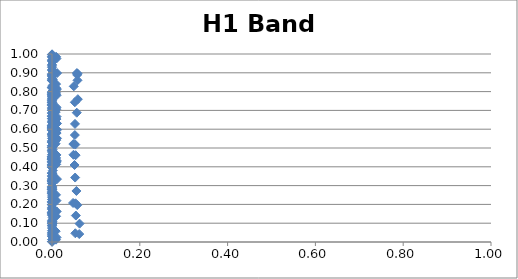
| Category | H1 Band 1 |
|---|---|
| 2.0123843859555475e-10 | 0.06 |
| 2.1284873776763067e-10 | 0.28 |
| 2.4249087996374483e-10 | 0.725 |
| 2.516043418277026e-10 | 0.312 |
| 2.564209724702538e-10 | 0.313 |
| 2.660455700669723e-10 | 0.41 |
| 2.730200291383123e-10 | 0.733 |
| 3.0289745515244437e-10 | 0.397 |
| 3.2020751368826646e-10 | 0.512 |
| 3.2856602494830163e-10 | 0.501 |
| 3.408278143051066e-10 | 0.443 |
| 4.097851320816054e-10 | 0.863 |
| 7.349655657294522e-09 | 0.214 |
| 7.65018932688669e-09 | 0.819 |
| 7.73707583981094e-09 | 0.259 |
| 8.053008278244601e-09 | 0.174 |
| 8.718170969962843e-09 | 0.178 |
| 9.017666419560588e-09 | 0.985 |
| 9.073001933340815e-09 | 0.8 |
| 9.175573883879208e-09 | 0.029 |
| 9.384345860370436e-09 | 0.04 |
| 9.490340358498547e-09 | 0.617 |
| 9.548495748271502e-09 | 0.116 |
| 9.71781717434907e-09 | 0.2 |
| 9.875696351178392e-09 | 0.577 |
| 1.0112151615350308e-08 | 0.086 |
| 1.0686748233231446e-08 | 0.479 |
| 1.1119259050346358e-08 | 0.965 |
| 1.1244268139276162e-08 | 0.148 |
| 1.1512530348595553e-08 | 0.744 |
| 1.1698698931164805e-08 | 0.529 |
| 1.1904995249875154e-08 | 0.502 |
| 1.1977496901092873e-08 | 0.436 |
| 1.2385362527585035e-08 | 0.796 |
| 1.409043215088435e-08 | 0.774 |
| 1.465629644231093e-08 | 0.184 |
| 2.0296841910398058e-07 | 0.27 |
| 2.126493957548408e-07 | 0.151 |
| 2.3696336486193496e-07 | 0.197 |
| 2.4433195648884153e-07 | 0.465 |
| 2.482074914962463e-07 | 0.199 |
| 2.5591380676002896e-07 | 0.743 |
| 2.614676844095914e-07 | 0.441 |
| 2.849876462575096e-07 | 0.409 |
| 2.9842655961281014e-07 | 0.789 |
| 3.0486981994032667e-07 | 0.213 |
| 3.1427016446304065e-07 | 0.617 |
| 3.4430345774041037e-07 | 0.969 |
| 3.453782721627504e-07 | 0.622 |
| 3.604348686617844e-07 | 0.912 |
| 3.6155830554331664e-07 | 0.264 |
| 3.660939813728588e-07 | 0.427 |
| 4.0089252118366086e-07 | 0.422 |
| 4.021375650303851e-07 | 0.349 |
| 4.131385414167058e-07 | 0.326 |
| 4.144203041751622e-07 | 0.885 |
| 4.1957669884489407e-07 | 0.655 |
| 4.208777500249124e-07 | 0.45 |
| 4.323733188605524e-07 | 0.289 |
| 4.3371267620116207e-07 | 0.888 |
| 4.415914221628172e-07 | 0.895 |
| 4.429583477603559e-07 | 0.604 |
| 4.805906362380123e-07 | 0.759 |
| 4.820739669948474e-07 | 0.858 |
| 5.028477053289416e-07 | 0.636 |
| 5.043973114204387e-07 | 0.595 |
| 5.135123268568432e-07 | 0.687 |
| 5.15093650492679e-07 | 0.013 |
| 5.290640899266363e-07 | 0.708 |
| 5.306916223052749e-07 | 0.786 |
| 6.146551888686216e-07 | 0.597 |
| 6.165361701717115e-07 | 0.367 |
| 6.31041391409473e-06 | 0.296 |
| 6.328080709409236e-06 | 0.413 |
| 6.515872484718176e-06 | 0.099 |
| 6.534090027938288e-06 | 0.732 |
| 6.574957987470465e-06 | 0.051 |
| 6.593333766484945e-06 | 0.209 |
| 6.78865616427812e-06 | 0.096 |
| 6.807603706784335e-06 | 0.93 |
| 7.232997842801017e-06 | 0.612 |
| 7.253131642748934e-06 | 0.728 |
| 7.430741538597282e-06 | 0.944 |
| 7.451402164979064e-06 | 0.455 |
| 7.467126288674207e-06 | 0.074 |
| 7.4878837799606925e-06 | 0.937 |
| 7.534448426711712e-06 | 0.454 |
| 7.555385088250692e-06 | 0.618 |
| 7.670992076103872e-06 | 0.669 |
| 7.692291906661945e-06 | 0.823 |
| 7.740072911208374e-06 | 0.684 |
| 7.761556363779417e-06 | 0.332 |
| 7.777906641504018e-06 | 0.277 |
| 7.79949062674656e-06 | 0.753 |
| 7.8877884321269e-06 | 0.159 |
| 7.909664269738018e-06 | 0.784 |
| 7.989885044339246e-06 | 0.142 |
| 8.012031887362622e-06 | 0.439 |
| 8.142160156747786e-06 | 0.11 |
| 8.16471090084991e-06 | 0.595 |
| 8.509139966817988e-06 | 0.563 |
| 8.53266267200566e-06 | 0.53 |
| 8.78264799454859e-06 | 0.293 |
| 8.806893819623011e-06 | 0.538 |
| 8.86128198266205e-06 | 0.779 |
| 8.885735509260473e-06 | 0.441 |
| 9.029410899657642e-06 | 0.485 |
| 9.054308228035128e-06 | 0.326 |
| 9.145605559635225e-06 | 0.366 |
| 9.170809374224552e-06 | 0.427 |
| 9.27391030061177e-06 | 0.322 |
| 9.299452331466796e-06 | 0.608 |
| 9.318891065062012e-06 | 0.239 |
| 9.34455161464139e-06 | 0.535 |
| 9.570881227905534e-06 | 0.672 |
| 9.597205245222242e-06 | 0.606 |
| 1.0606206469333214e-05 | 0.104 |
| 1.0635247963876419e-05 | 0.489 |
| 1.0943835182141853e-05 | 0.259 |
| 1.0973760080052698e-05 | 0.996 |
| 8.675395274580344e-05 | 0.657 |
| 8.696857291424382e-05 | 0.57 |
| 8.897024512079107e-05 | 0.7 |
| 8.996016211466051e-05 | 0.456 |
| 9.018228133443155e-05 | 0.88 |
| 9.786876551179167e-05 | 0.279 |
| 9.81093150467191e-05 | 0.322 |
| 0.00010022780295490791 | 0.551 |
| 0.00010035262601062675 | 0.281 |
| 0.00010047383231343468 | 0.44 |
| 0.00010146191651170184 | 0.397 |
| 0.00010171080947726887 | 0.984 |
| 0.00010276820760266549 | 0.158 |
| 0.00010390272288208066 | 0.444 |
| 0.00010415727323455946 | 0.002 |
| 0.0001044986523195154 | 0.512 |
| 0.00010565121552869393 | 0.225 |
| 0.00010590981361826417 | 0.61 |
| 0.00010832130851313019 | 0.504 |
| 0.00011296296213118084 | 0.763 |
| 0.00011323844327231973 | 0.87 |
| 0.00011580725275794336 | 0.824 |
| 0.00011707732300466711 | 0.339 |
| 0.0001173622745706668 | 0.89 |
| 0.00011774441738652323 | 0.701 |
| 0.00011903454361672833 | 0.715 |
| 0.00011932399305787387 | 0.155 |
| 0.00012055361902947489 | 0.403 |
| 0.00012187279338770368 | 0.352 |
| 0.00012202295176351142 | 0.667 |
| 0.0001221687572817583 | 0.75 |
| 0.0001249284124238082 | 0.033 |
| 0.0001311279036804823 | 0.001 |
| 0.00013570720650591384 | 0.364 |
| 0.00013586378897921647 | 0.998 |
| 0.00013718236994727801 | 0.643 |
| 0.00013751331554332104 | 0.743 |
| 0.00014059888372409458 | 0.96 |
| 0.00014752881339652043 | 0.088 |
| 0.00015100393556571732 | 0.795 |
| 0.0001528211439889713 | 0.572 |
| 0.00015641364278391474 | 0.286 |
| 0.00015898592249189512 | 0.859 |
| 0.00016973172307720977 | 0.047 |
| 0.00017577106239763905 | 0.002 |
| 0.00017864220745446313 | 0.917 |
| 0.00018280376986441174 | 0.25 |
| 0.00020521238882941785 | 0.771 |
| 0.001205681298176634 | 0.182 |
| 0.0012349664741614942 | 0.641 |
| 0.0012433427028495695 | 0.107 |
| 0.00127347256711544 | 0.983 |
| 0.0013353286724743806 | 0.227 |
| 0.0013625286842363614 | 0.708 |
| 0.0013675123231788847 | 0.491 |
| 0.001376716422606586 | 0.406 |
| 0.001395317193551474 | 0.362 |
| 0.001404694040181742 | 0.097 |
| 0.0014098200022086115 | 0.354 |
| 0.00142466987017297 | 0.13 |
| 0.0014384180769863753 | 0.047 |
| 0.0014588362299419587 | 0.69 |
| 0.0015076284579293889 | 0.71 |
| 0.0015436258730169741 | 0.233 |
| 0.0015539191033448047 | 0.347 |
| 0.0015758452392378012 | 0.45 |
| 0.0015909342410844929 | 0.165 |
| 0.0016075359634506832 | 0.833 |
| 0.0016133414637460718 | 0.864 |
| 0.0016457264411810506 | 0.766 |
| 0.001776450230748481 | 0.38 |
| 0.0018183204567124983 | 0.395 |
| 0.008248838611417198 | 0.523 |
| 0.008384364521471437 | 0.058 |
| 0.008399189756996599 | 0.16 |
| 0.00846597446733716 | 0.691 |
| 0.00899172065670219 | 0.794 |
| 0.009138106298343862 | 0.012 |
| 0.00914598671101071 | 0.251 |
| 0.009154118043015792 | 0.554 |
| 0.009226244241309769 | 0.787 |
| 0.009294612360775415 | 0.137 |
| 0.009310868828244601 | 0.84 |
| 0.009384096695106307 | 0.654 |
| 0.009406032065405967 | 0.447 |
| 0.00942246242277262 | 0.541 |
| 0.009496473082238615 | 0.985 |
| 0.009650169396785868 | 0.413 |
| 0.009666979819986299 | 0.653 |
| 0.009960326810377377 | 0.706 |
| 0.01012069550475376 | 0.463 |
| 0.010138234827869859 | 0.976 |
| 0.010217237526948315 | 0.717 |
| 0.010240901526594709 | 0.22 |
| 0.010258626320890777 | 0.818 |
| 0.01033846389989234 | 0.78 |
| 0.010414133802247831 | 0.433 |
| 0.010432125364654285 | 0.025 |
| 0.010504240713037767 | 0.579 |
| 0.010513163761943722 | 0.667 |
| 0.010522370795139008 | 0.811 |
| 0.01068142992684914 | 0.426 |
| 0.0106998319255228 | 0.163 |
| 0.011327860996625699 | 0.335 |
| 0.011347249825948386 | 0.551 |
| 0.011434577601193496 | 0.63 |
| 0.011615880806594188 | 0.597 |
| 0.01163570677385138 | 0.898 |
| 0.047926681397543344 | 0.208 |
| 0.04857987146610265 | 0.521 |
| 0.04892758078127738 | 0.464 |
| 0.04959212195001045 | 0.828 |
| 0.051326780263365165 | 0.41 |
| 0.052018312109956354 | 0.569 |
| 0.052024487362549686 | 0.743 |
| 0.05238638129924764 | 0.628 |
| 0.05272381170316878 | 0.343 |
| 0.05308973766006187 | 0.046 |
| 0.05309601833261545 | 0.518 |
| 0.05359950536409357 | 0.206 |
| 0.05380726167127222 | 0.462 |
| 0.05431632904497196 | 0.141 |
| 0.05566311364314363 | 0.271 |
| 0.05640267709046556 | 0.688 |
| 0.05679624636416254 | 0.899 |
| 0.05732857146829698 | 0.889 |
| 0.0575482075837964 | 0.196 |
| 0.05808633560124565 | 0.86 |
| 0.058093101290302596 | 0.896 |
| 0.05885917601950252 | 0.76 |
| 0.06207660008255245 | 0.042 |
| 0.06288553642916007 | 0.098 |